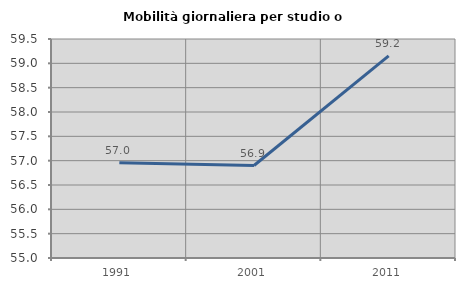
| Category | Mobilità giornaliera per studio o lavoro |
|---|---|
| 1991.0 | 56.96 |
| 2001.0 | 56.9 |
| 2011.0 | 59.155 |